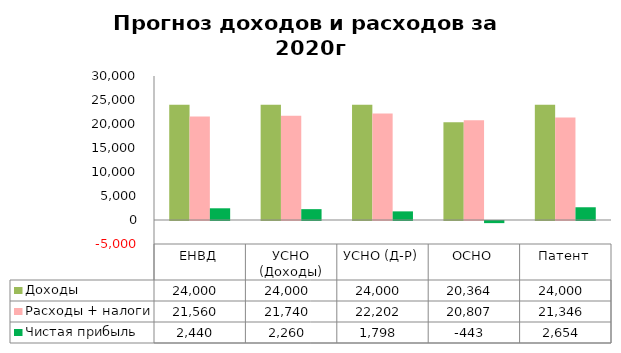
| Category | Доходы | Расходы + налоги | Чистая прибыль |
|---|---|---|---|
| ЕНВД | 24000 | 21560 | 2440 |
| УСНО (Доходы) | 24000 | 21740 | 2260 |
| УСНО (Д-Р) | 24000 | 22202 | 1798 |
| ОСНО | 20363.636 | 20806.909 | -443.273 |
| Патент | 24000 | 21346.4 | 2653.6 |